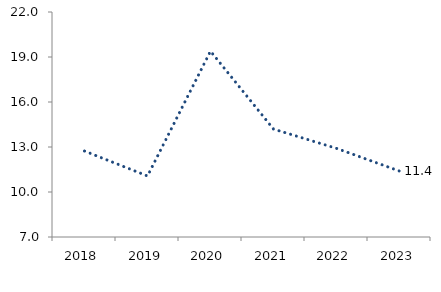
| Category | Series 0 |
|---|---|
| 2018.0 | 12.73 |
| 2019.0 | 11.067 |
| 2020.0 | 19.389 |
| 2021.0 | 14.194 |
| 2022.0 | 12.91 |
| 2023.0 | 11.395 |